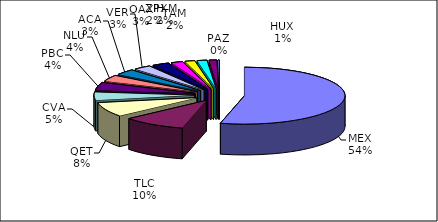
| Category | Series 0 |
|---|---|
| MEX | 207145 |
| TLC | 38927 |
| QET | 31545 |
| CVA | 17848 |
| PBC | 17003 |
| NLU | 13487 |
| ACA | 12580 |
| VER | 10894 |
| OAX | 10485 |
| TAM | 7067 |
| ZIH | 6087 |
| PXM | 6032 |
| HUX | 4734 |
| PAZ | 828 |